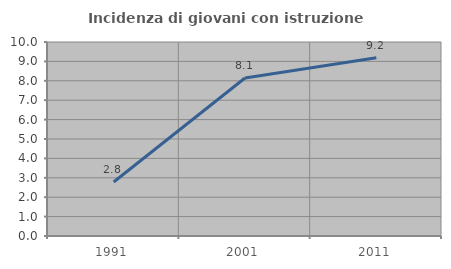
| Category | Incidenza di giovani con istruzione universitaria |
|---|---|
| 1991.0 | 2.782 |
| 2001.0 | 8.147 |
| 2011.0 | 9.186 |